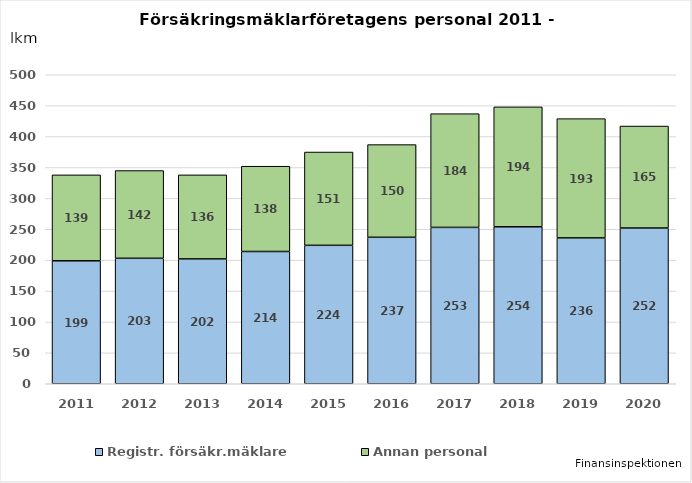
| Category | Registr. försäkr.mäklare | Annan personal |
|---|---|---|
| 2011.0 | 199 | 139 |
| 2012.0 | 203 | 142 |
| 2013.0 | 202 | 136 |
| 2014.0 | 214 | 138 |
| 2015.0 | 224 | 151 |
| 2016.0 | 237 | 150 |
| 2017.0 | 253 | 184 |
| 2018.0 | 254 | 194 |
| 2019.0 | 236 | 193 |
| 2020.0 | 252 | 165 |